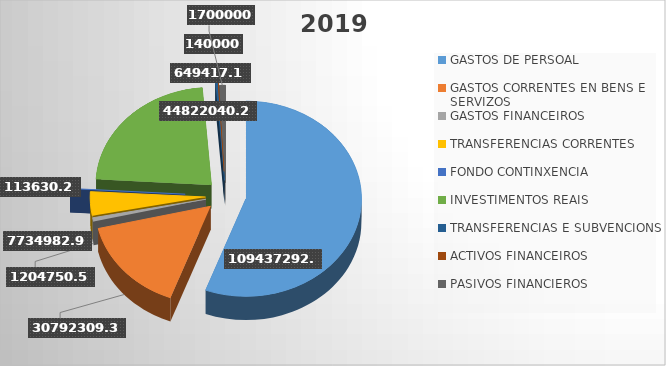
| Category | Series 0 |
|---|---|
| GASTOS DE PERSOAL                        | 109437292.26 |
| GASTOS CORRENTES EN BENS E SERVIZOS | 30792309.38 |
| GASTOS FINANCEIROS                               | 1204750.52 |
| TRANSFERENCIAS CORRENTES                          | 7734982.93 |
| FONDO CONTINXENCIA                           | 113630.25 |
| INVESTIMENTOS REAIS                        | 44822040.27 |
| TRANSFERENCIAS E SUBVENCIONS | 649417.11 |
| ACTIVOS FINANCEIROS                          | 140000 |
| PASIVOS FINANCIEROS              | 1700000 |